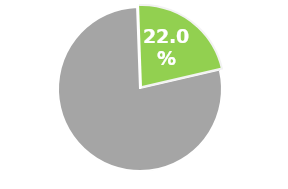
| Category | Series 0 |
|---|---|
| 0 | 0.78 |
| 1 | 0.22 |